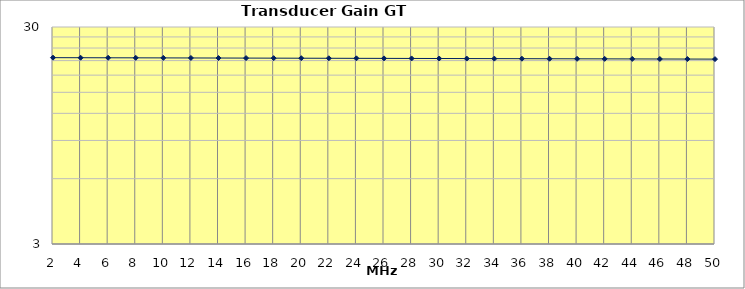
| Category | Gain GT (dB) |
|---|---|
| 2.0 | 21.669 |
| 4.0 | 21.654 |
| 6.0 | 21.64 |
| 8.0 | 21.626 |
| 10.0 | 21.612 |
| 12.0 | 21.598 |
| 14.0 | 21.585 |
| 16.0 | 21.571 |
| 18.0 | 21.557 |
| 20.0 | 21.543 |
| 22.0 | 21.529 |
| 24.0 | 21.515 |
| 26.0 | 21.501 |
| 28.0 | 21.488 |
| 30.0 | 21.474 |
| 32.0 | 21.46 |
| 34.0 | 21.446 |
| 36.0 | 21.433 |
| 38.0 | 21.419 |
| 40.0 | 21.405 |
| 42.0 | 21.392 |
| 44.0 | 21.378 |
| 46.0 | 21.364 |
| 48.0 | 21.351 |
| 50.0 | 21.337 |